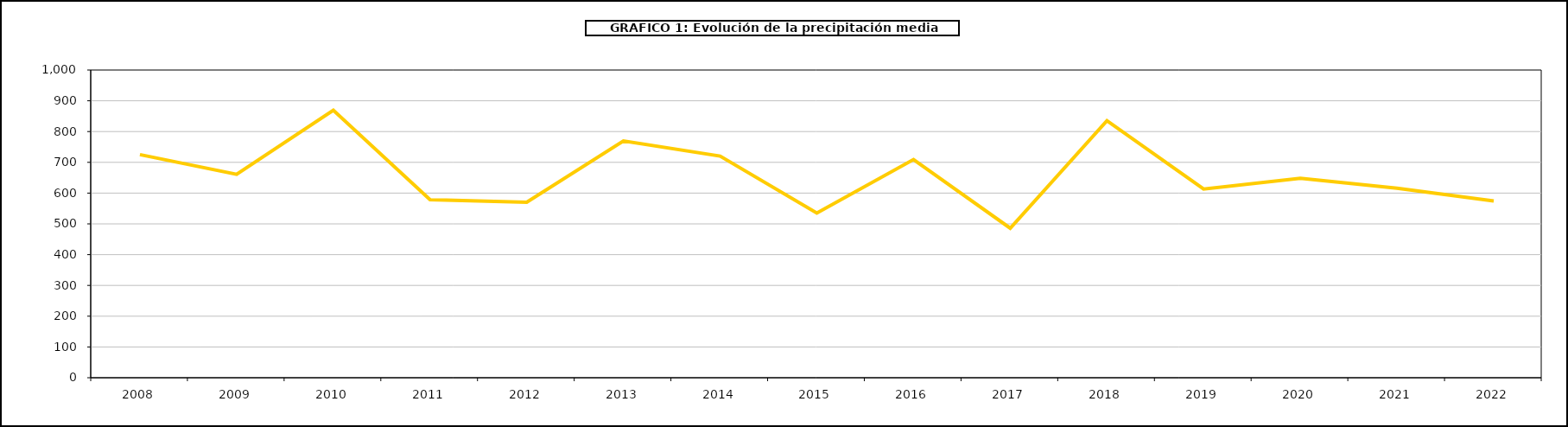
| Category | Series 0 |
|---|---|
| 2008.0 | 725 |
| 2009.0 | 661 |
| 2010.0 | 869.377 |
| 2011.0 | 578.444 |
| 2012.0 | 570.087 |
| 2013.0 | 769.551 |
| 2014.0 | 720.348 |
| 2015.0 | 535.081 |
| 2016.0 | 709 |
| 2017.0 | 486 |
| 2018.0 | 835.465 |
| 2019.0 | 613.3 |
| 2020.0 | 647.9 |
| 2021.0 | 615.6 |
| 2022.0 | 574.7 |